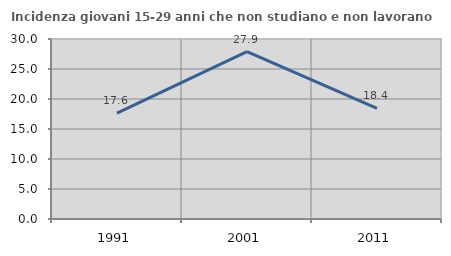
| Category | Incidenza giovani 15-29 anni che non studiano e non lavorano  |
|---|---|
| 1991.0 | 17.647 |
| 2001.0 | 27.907 |
| 2011.0 | 18.421 |